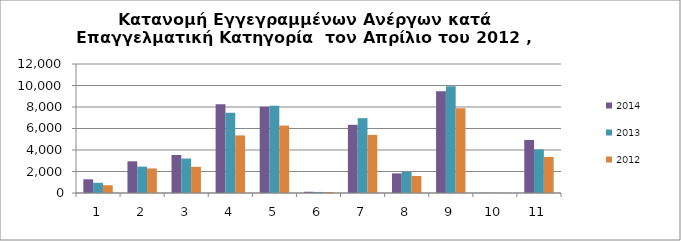
| Category | 2014 | 2013 | 2012 |
|---|---|---|---|
| 1.0 | 1274 | 952 | 722 |
| 2.0 | 2948 | 2451 | 2285 |
| 3.0 | 3538 | 3206 | 2435 |
| 4.0 | 8264 | 7468 | 5356 |
| 5.0 | 8028 | 8112 | 6274 |
| 6.0 | 117 | 98 | 87 |
| 7.0 | 6345 | 6960 | 5408 |
| 8.0 | 1824 | 1960 | 1584 |
| 9.0 | 9464 | 9926 | 7882 |
| 10.0 | 22 | 15 | 16 |
| 11.0 | 4934 | 4053 | 3349 |